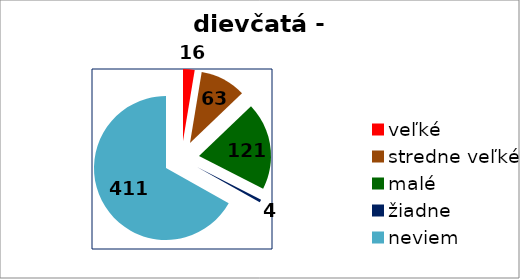
| Category | dievčatá |
|---|---|
| veľké | 16 |
| stredne veľké | 63 |
| malé | 121 |
| žiadne | 4 |
| neviem | 411 |